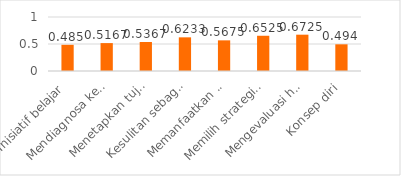
| Category | Series 2 |
|---|---|
| Inisiatif belajar | 0.485 |
| Mendiagnosa kebutuhan belajar | 0.517 |
| Menetapkan tujuan belajar | 0.537 |
| Kesulitan sebagai tantangan | 0.623 |
| Memanfaatkan sumber relevan | 0.568 |
| Memilih strategi belajar | 0.652 |
| Mengevaluasi hasil belajar | 0.672 |
| Konsep diri | 0.494 |